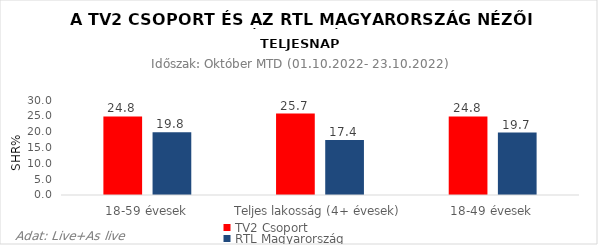
| Category | TV2 Csoport | RTL Magyarország |
|---|---|---|
| 18-59 évesek | 24.8 | 19.8 |
| Teljes lakosság (4+ évesek) | 25.7 | 17.4 |
| 18-49 évesek | 24.8 | 19.7 |